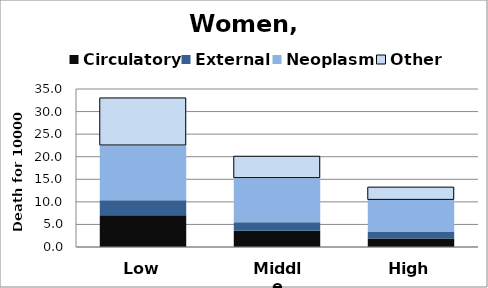
| Category | Circulatory | External | Neoplasm | Other |
|---|---|---|---|---|
| Low | 7.006 | 3.36 | 12.124 | 10.529 |
| Middle | 3.616 | 1.861 | 9.779 | 4.846 |
| High | 1.886 | 1.43 | 7.121 | 2.827 |